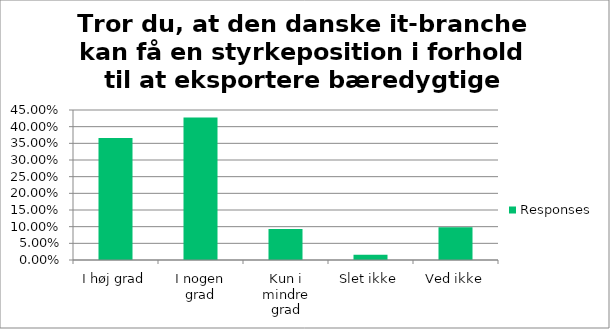
| Category | Responses |
|---|---|
| I høj grad | 0.366 |
| I nogen grad | 0.428 |
| Kun i mindre grad | 0.093 |
| Slet ikke | 0.016 |
| Ved ikke | 0.098 |